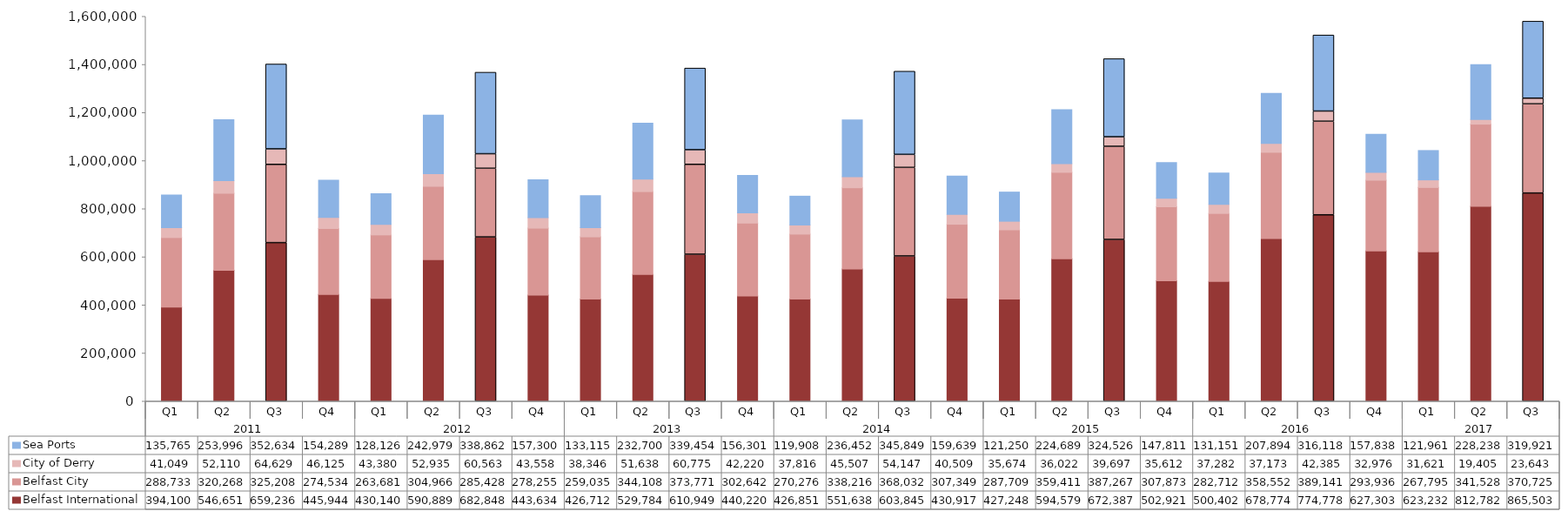
| Category | Belfast International  | Belfast City  | City of Derry | Sea Ports  |
|---|---|---|---|---|
| 0 | 394100 | 288733 | 41049 | 135765 |
| 1 | 546651 | 320268 | 52110 | 253996 |
| 2 | 659236 | 325208 | 64629 | 352634 |
| 3 | 445944 | 274534 | 46125 | 154289 |
| 4 | 430140 | 263681 | 43380 | 128126 |
| 5 | 590889 | 304966 | 52935 | 242979 |
| 6 | 682848 | 285428 | 60563 | 338862 |
| 7 | 443634 | 278255 | 43558 | 157300 |
| 8 | 426712 | 259035 | 38346 | 133115 |
| 9 | 529784 | 344108 | 51638 | 232700 |
| 10 | 610949 | 373771 | 60775 | 339454 |
| 11 | 440220 | 302642 | 42220 | 156301 |
| 12 | 426851 | 270276 | 37816 | 119908 |
| 13 | 551638 | 338216 | 45507 | 236452 |
| 14 | 603845 | 368032 | 54147 | 345849 |
| 15 | 430917 | 307349 | 40509 | 159639 |
| 16 | 427248 | 287709 | 35674 | 121250 |
| 17 | 594579 | 359411 | 36022 | 224689 |
| 18 | 672387 | 387267 | 39697 | 324526 |
| 19 | 502921 | 307873 | 35612 | 147811 |
| 20 | 500402 | 282712 | 37282 | 131151 |
| 21 | 678774 | 358552 | 37173 | 207894 |
| 22 | 774778 | 389141 | 42385 | 316118 |
| 23 | 627303 | 293936 | 32976 | 157838 |
| 24 | 623232 | 267795 | 31621 | 121961 |
| 25 | 812782 | 341528 | 19405 | 228238 |
| 26 | 865503 | 370725 | 23643 | 319921 |